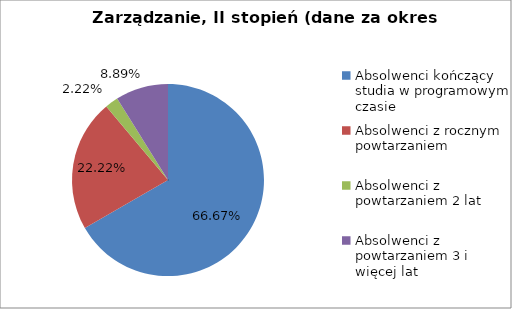
| Category | Series 0 |
|---|---|
| Absolwenci kończący studia w programowym czasie | 66.667 |
| Absolwenci z rocznym powtarzaniem | 22.222 |
| Absolwenci z powtarzaniem 2 lat | 2.222 |
| Absolwenci z powtarzaniem 3 i więcej lat | 8.889 |